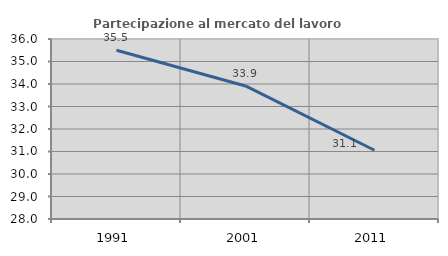
| Category | Partecipazione al mercato del lavoro  femminile |
|---|---|
| 1991.0 | 35.501 |
| 2001.0 | 33.913 |
| 2011.0 | 31.054 |